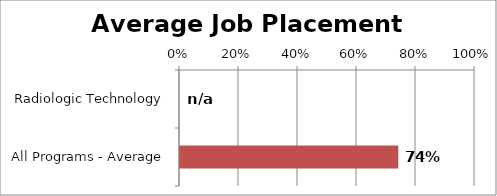
| Category | Series 0 |
|---|---|
| Radiologic Technology | 0 |
| All Programs - Average | 0.74 |